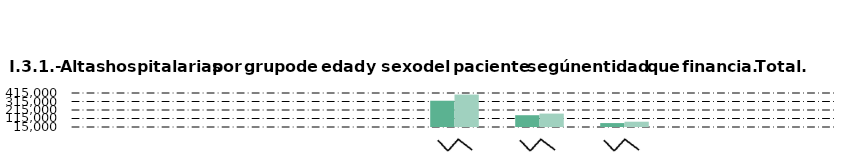
| Category |     Hombre |     Mujer |
|---|---|---|
| Andalucía | 222 | 301 |
| Castilla y León  | 737 | 956 |
| Castilla - La Mancha | 951 | 2042 |
| Extremadura | 347 | 267 |
| Madrid (Comunidad de) | 324045 | 396470 |
| Resto de CC.AA. | 153656 | 172628 |
| Mutualidades y aseguradoras | 61166 | 77405 |
| Particulares | 4042 | 11207 |
| Otros | 777 | 1569 |